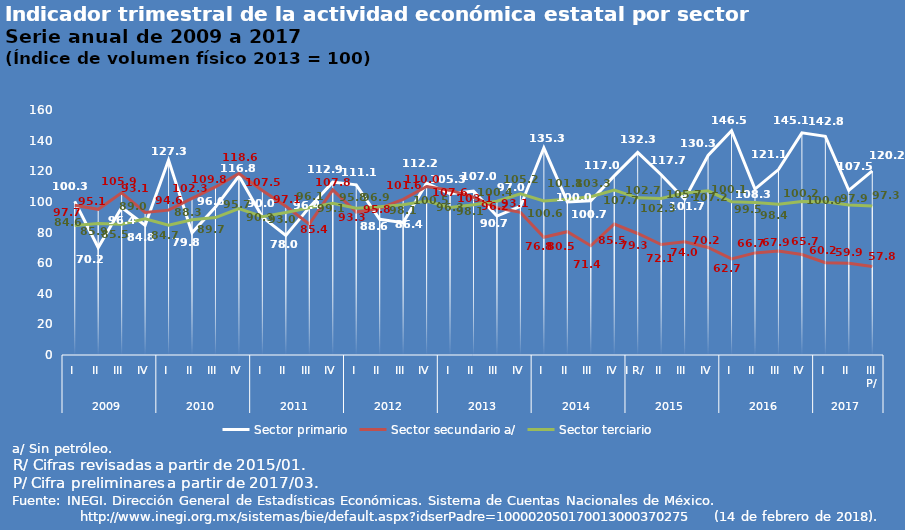
| Category | Sector primario | Sector secundario a/ | Sector terciario |
|---|---|---|---|
| 0 | 100.285 | 97.748 | 84.591 |
| 1 | 70.196 | 95.126 | 85.852 |
| 2 | 96.361 | 105.927 | 85.457 |
| 3 | 84.765 | 93.127 | 88.959 |
| 4 | 127.332 | 94.598 | 84.714 |
| 5 | 79.828 | 102.287 | 88.334 |
| 6 | 96.597 | 109.761 | 89.74 |
| 7 | 116.846 | 118.566 | 95.662 |
| 8 | 90.048 | 107.466 | 90.283 |
| 9 | 78.034 | 97.118 | 93.002 |
| 10 | 96.396 | 85.407 | 96.126 |
| 11 | 112.906 | 107.824 | 99.073 |
| 12 | 111.116 | 93.331 | 95.807 |
| 13 | 88.609 | 95.761 | 96.864 |
| 14 | 86.45 | 101.645 | 98.145 |
| 15 | 112.182 | 110.038 | 100.523 |
| 16 | 105.255 | 107.648 | 96.286 |
| 17 | 106.995 | 103.051 | 98.077 |
| 18 | 90.743 | 96.159 | 100.409 |
| 19 | 97.007 | 93.142 | 105.228 |
| 20 | 135.318 | 76.85 | 100.579 |
| 21 | 99.971 | 80.516 | 101.778 |
| 22 | 100.68 | 71.352 | 103.343 |
| 23 | 116.96 | 85.507 | 107.688 |
| 24 | 132.302 | 79.35 | 102.651 |
| 25 | 117.735 | 72.149 | 102.271 |
| 26 | 101.741 | 74.002 | 105.728 |
| 27 | 130.328 | 70.243 | 107.186 |
| 28 | 146.524 | 62.735 | 100.115 |
| 29 | 108.332 | 66.666 | 99.545 |
| 30 | 121.081 | 67.891 | 98.435 |
| 31 | 145.056 | 65.657 | 100.24 |
| 32 | 142.783 | 60.23 | 100.048 |
| 33 | 107.537 | 59.927 | 97.922 |
| 34 | 120.23 | 57.768 | 97.258 |